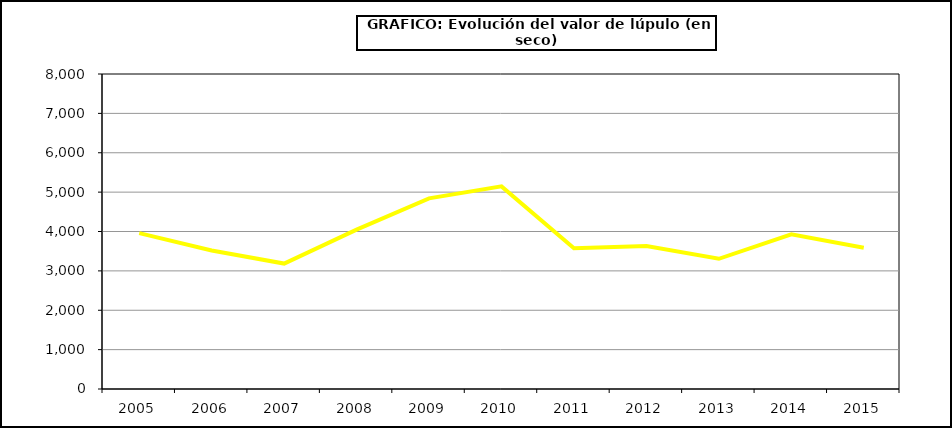
| Category | Valor |
|---|---|
| 2005.0 | 3960.078 |
| 2006.0 | 3518.5 |
| 2007.0 | 3185.28 |
| 2008.0 | 4045.86 |
| 2009.0 | 4841.88 |
| 2010.0 | 5145.68 |
| 2011.0 | 3575.44 |
| 2012.0 | 3629.5 |
| 2013.0 | 3307.08 |
| 2014.0 | 3927.8 |
| 2015.0 | 3588 |